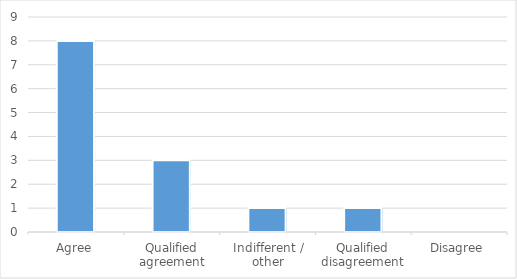
| Category | Series 0 |
|---|---|
| Agree | 8 |
| Qualified agreement | 3 |
| Indifferent / other | 1 |
| Qualified disagreement | 1 |
| Disagree | 0 |